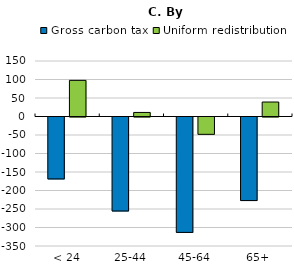
| Category | Gross carbon tax | Uniform redistribution |
|---|---|---|
| < 24 | -167.373 | 97.669 |
| 25-44 | -254.095 | 10.948 |
| 45-64 | -311.883 | -46.84 |
| 65+ | -225.926 | 39.117 |